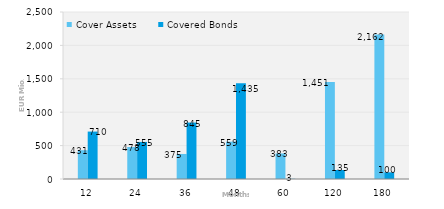
| Category | Cover Assets | Covered Bonds |
|---|---|---|
| 12.0 | 431.148 | 710 |
| 24.0 | 478.449 | 555 |
| 36.0 | 374.817 | 845 |
| 48.0 | 559.078 | 1435 |
| 60.0 | 382.634 | 3 |
| 120.0 | 1450.584 | 135 |
| 180.0 | 2161.571 | 100 |